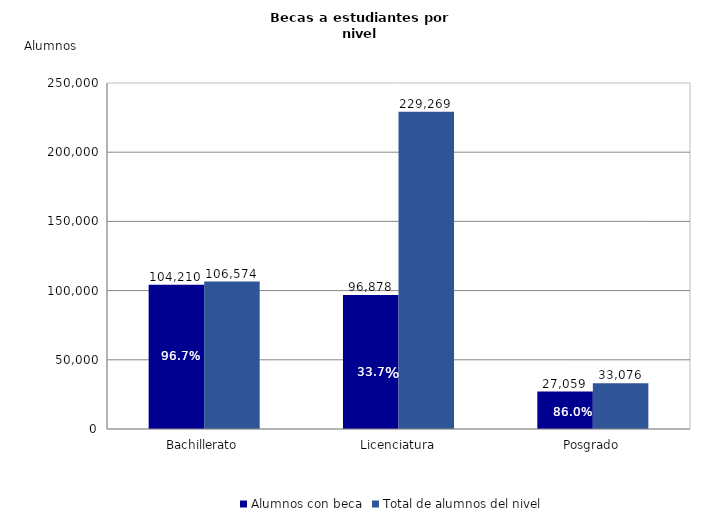
| Category | Alumnos con beca | Total de alumnos del nivel |
|---|---|---|
| Bachillerato | 104210 | 106574 |
| Licenciatura | 96878 | 229269 |
| Posgrado | 27059 | 33076 |